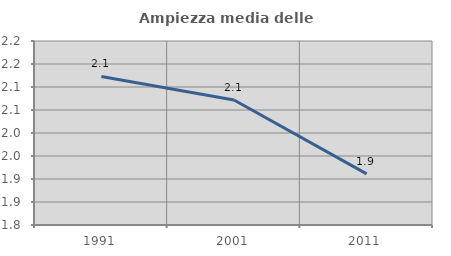
| Category | Ampiezza media delle famiglie |
|---|---|
| 1991.0 | 2.123 |
| 2001.0 | 2.072 |
| 2011.0 | 1.911 |